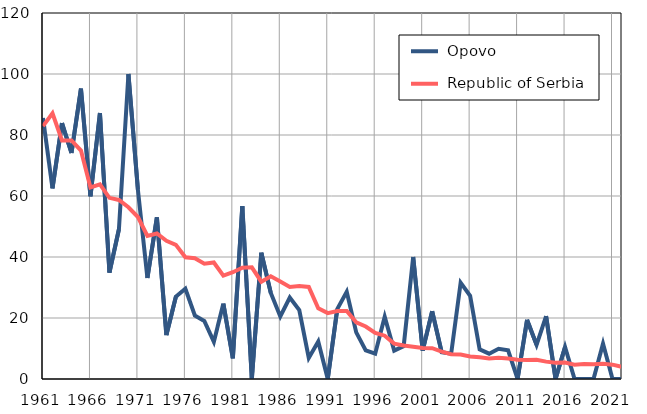
| Category |  Opovo |  Republic of Serbia |
|---|---|---|
| 1961.0 | 85.6 | 82.9 |
| 1962.0 | 62.5 | 87.1 |
| 1963.0 | 83.9 | 78.2 |
| 1964.0 | 74.1 | 78.2 |
| 1965.0 | 95.2 | 74.9 |
| 1966.0 | 59.9 | 62.8 |
| 1967.0 | 87.2 | 63.8 |
| 1968.0 | 34.9 | 59.4 |
| 1969.0 | 49.1 | 58.7 |
| 1970.0 | 100 | 56.3 |
| 1971.0 | 62 | 53.1 |
| 1972.0 | 33.1 | 46.9 |
| 1973.0 | 53 | 47.7 |
| 1974.0 | 14.4 | 45.3 |
| 1975.0 | 27 | 44 |
| 1976.0 | 29.6 | 39.9 |
| 1977.0 | 20.8 | 39.6 |
| 1978.0 | 19 | 37.8 |
| 1979.0 | 12.2 | 38.2 |
| 1980.0 | 24.7 | 33.9 |
| 1981.0 | 6.8 | 35 |
| 1982.0 | 56.7 | 36.5 |
| 1983.0 | 0 | 36.6 |
| 1984.0 | 41.4 | 31.9 |
| 1985.0 | 28.2 | 33.7 |
| 1986.0 | 20.5 | 32 |
| 1987.0 | 26.7 | 30.2 |
| 1988.0 | 22.6 | 30.5 |
| 1989.0 | 6.9 | 30.2 |
| 1990.0 | 12.3 | 23.2 |
| 1991.0 | 0 | 21.6 |
| 1992.0 | 22.9 | 22.3 |
| 1993.0 | 28.6 | 22.3 |
| 1994.0 | 15.3 | 18.6 |
| 1995.0 | 9.4 | 17.2 |
| 1996.0 | 8.3 | 15.1 |
| 1997.0 | 20.4 | 14.2 |
| 1998.0 | 9.3 | 11.6 |
| 1999.0 | 10.8 | 11 |
| 2000.0 | 40 | 10.6 |
| 2001.0 | 9.3 | 10.2 |
| 2002.0 | 22.2 | 10.1 |
| 2003.0 | 8.8 | 9 |
| 2004.0 | 8.3 | 8.1 |
| 2005.0 | 31.6 | 8 |
| 2006.0 | 27.3 | 7.4 |
| 2007.0 | 9.7 | 7.1 |
| 2008.0 | 8.3 | 6.7 |
| 2009.0 | 9.9 | 7 |
| 2010.0 | 9.4 | 6.7 |
| 2011.0 | 0 | 6.3 |
| 2012.0 | 19.4 | 6.2 |
| 2013.0 | 11.2 | 6.3 |
| 2014.0 | 20.6 | 5.7 |
| 2015.0 | 0 | 5.3 |
| 2016.0 | 10.5 | 5.4 |
| 2017.0 | 0 | 4.7 |
| 2018.0 | 0 | 4.9 |
| 2019.0 | 0 | 4.8 |
| 2020.0 | 11.6 | 5 |
| 2021.0 | 0 | 4.7 |
| 2022.0 | 0 | 4 |